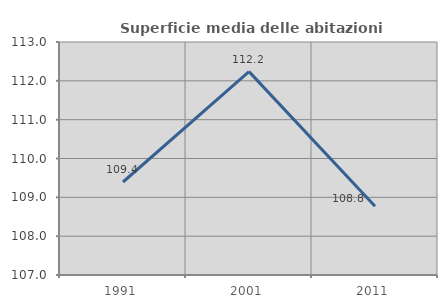
| Category | Superficie media delle abitazioni occupate |
|---|---|
| 1991.0 | 109.395 |
| 2001.0 | 112.238 |
| 2011.0 | 108.77 |